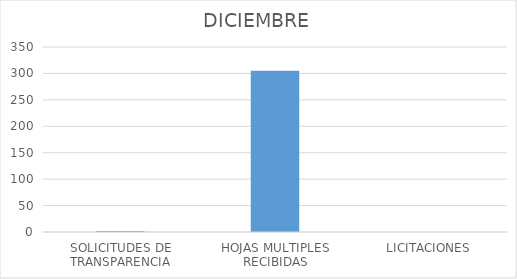
| Category | DICIEMBRE |
|---|---|
| SOLICITUDES DE TRANSPARENCIA | 2 |
| HOJAS MULTIPLES RECIBIDAS | 305 |
| LICITACIONES | 0 |